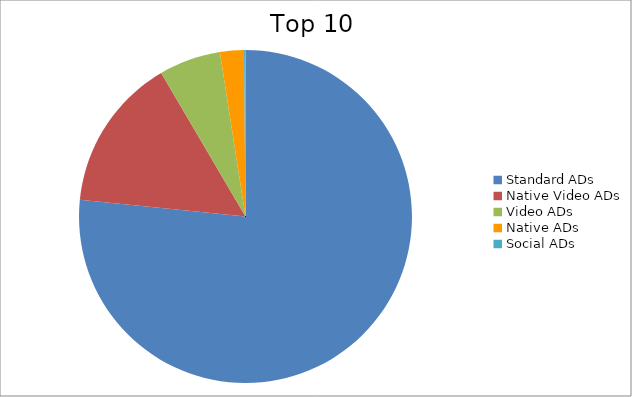
| Category | Series 0 |
|---|---|
| Standard ADs | 76.61 |
| Native Video ADs | 14.94 |
| Video ADs | 5.99 |
| Native ADs | 2.32 |
| Social ADs | 0.14 |